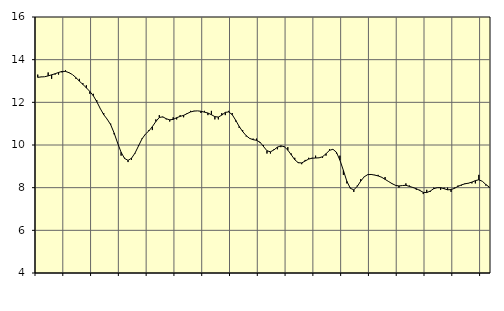
| Category | Piggar | Tillverkning av verkstadsvaror, SNI 25-30, 33 |
|---|---|---|
| nan | 13.3 | 13.17 |
| 87.0 | 13.2 | 13.19 |
| 87.0 | 13.2 | 13.2 |
| 87.0 | 13.4 | 13.24 |
| nan | 13.1 | 13.29 |
| 88.0 | 13.3 | 13.34 |
| 88.0 | 13.3 | 13.4 |
| 88.0 | 13.4 | 13.45 |
| nan | 13.5 | 13.45 |
| 89.0 | 13.4 | 13.39 |
| 89.0 | 13.3 | 13.3 |
| 89.0 | 13.1 | 13.16 |
| nan | 13.1 | 12.99 |
| 90.0 | 12.9 | 12.84 |
| 90.0 | 12.8 | 12.68 |
| 90.0 | 12.4 | 12.51 |
| nan | 12.4 | 12.31 |
| 91.0 | 12.1 | 12.03 |
| 91.0 | 11.7 | 11.71 |
| 91.0 | 11.5 | 11.42 |
| nan | 11.2 | 11.21 |
| 92.0 | 11 | 10.95 |
| 92.0 | 10.5 | 10.56 |
| 92.0 | 10.1 | 10.09 |
| nan | 9.5 | 9.66 |
| 93.0 | 9.4 | 9.37 |
| 93.0 | 9.2 | 9.28 |
| 93.0 | 9.3 | 9.38 |
| nan | 9.6 | 9.62 |
| 94.0 | 10 | 9.95 |
| 94.0 | 10.3 | 10.28 |
| 94.0 | 10.5 | 10.51 |
| nan | 10.7 | 10.66 |
| 95.0 | 10.7 | 10.86 |
| 95.0 | 11.2 | 11.1 |
| 95.0 | 11.4 | 11.29 |
| nan | 11.3 | 11.32 |
| 96.0 | 11.2 | 11.23 |
| 96.0 | 11.1 | 11.18 |
| 96.0 | 11.3 | 11.2 |
| nan | 11.2 | 11.28 |
| 97.0 | 11.4 | 11.34 |
| 97.0 | 11.3 | 11.39 |
| 97.0 | 11.5 | 11.47 |
| nan | 11.6 | 11.55 |
| 98.0 | 11.6 | 11.59 |
| 98.0 | 11.6 | 11.6 |
| 98.0 | 11.5 | 11.58 |
| nan | 11.6 | 11.54 |
| 99.0 | 11.4 | 11.5 |
| 99.0 | 11.6 | 11.42 |
| 99.0 | 11.2 | 11.33 |
| nan | 11.2 | 11.31 |
| 0.0 | 11.5 | 11.4 |
| 0.0 | 11.4 | 11.53 |
| 0.0 | 11.6 | 11.55 |
| nan | 11.5 | 11.42 |
| 1.0 | 11.1 | 11.16 |
| 1.0 | 10.8 | 10.87 |
| 1.0 | 10.7 | 10.63 |
| nan | 10.4 | 10.44 |
| 2.0 | 10.3 | 10.31 |
| 2.0 | 10.3 | 10.25 |
| 2.0 | 10.3 | 10.22 |
| nan | 10.1 | 10.13 |
| 3.0 | 10 | 9.93 |
| 3.0 | 9.6 | 9.73 |
| 3.0 | 9.6 | 9.68 |
| nan | 9.8 | 9.77 |
| 4.0 | 9.8 | 9.9 |
| 4.0 | 9.9 | 9.96 |
| 4.0 | 9.9 | 9.92 |
| nan | 9.9 | 9.76 |
| 5.0 | 9.6 | 9.54 |
| 5.0 | 9.4 | 9.31 |
| 5.0 | 9.2 | 9.17 |
| nan | 9.1 | 9.16 |
| 6.0 | 9.3 | 9.25 |
| 6.0 | 9.4 | 9.34 |
| 6.0 | 9.4 | 9.38 |
| nan | 9.5 | 9.39 |
| 7.0 | 9.4 | 9.4 |
| 7.0 | 9.4 | 9.45 |
| 7.0 | 9.5 | 9.59 |
| nan | 9.8 | 9.75 |
| 8.0 | 9.8 | 9.8 |
| 8.0 | 9.6 | 9.66 |
| 8.0 | 9.5 | 9.29 |
| nan | 8.6 | 8.81 |
| 9.0 | 8.2 | 8.3 |
| 9.0 | 8 | 7.97 |
| 9.0 | 7.8 | 7.9 |
| nan | 8.1 | 8.06 |
| 10.0 | 8.4 | 8.31 |
| 10.0 | 8.5 | 8.51 |
| 10.0 | 8.6 | 8.61 |
| nan | 8.6 | 8.62 |
| 11.0 | 8.6 | 8.59 |
| 11.0 | 8.6 | 8.55 |
| 11.0 | 8.5 | 8.49 |
| nan | 8.5 | 8.39 |
| 12.0 | 8.3 | 8.29 |
| 12.0 | 8.2 | 8.19 |
| 12.0 | 8.1 | 8.11 |
| nan | 8 | 8.08 |
| 13.0 | 8.1 | 8.1 |
| 13.0 | 8.2 | 8.11 |
| 13.0 | 8.1 | 8.06 |
| nan | 8 | 8.01 |
| 14.0 | 7.9 | 7.95 |
| 14.0 | 7.9 | 7.87 |
| 14.0 | 7.7 | 7.78 |
| nan | 7.9 | 7.77 |
| 15.0 | 7.8 | 7.84 |
| 15.0 | 8 | 7.95 |
| 15.0 | 8 | 8 |
| nan | 7.9 | 8 |
| 16.0 | 8 | 7.95 |
| 16.0 | 8 | 7.9 |
| 16.0 | 7.8 | 7.91 |
| nan | 8 | 7.97 |
| 17.0 | 8.1 | 8.06 |
| 17.0 | 8.1 | 8.13 |
| 17.0 | 8.2 | 8.18 |
| nan | 8.2 | 8.21 |
| 18.0 | 8.2 | 8.26 |
| 18.0 | 8.2 | 8.33 |
| 18.0 | 8.6 | 8.37 |
| nan | 8.3 | 8.3 |
| 19.0 | 8.1 | 8.15 |
| 19.0 | 8 | 8.03 |